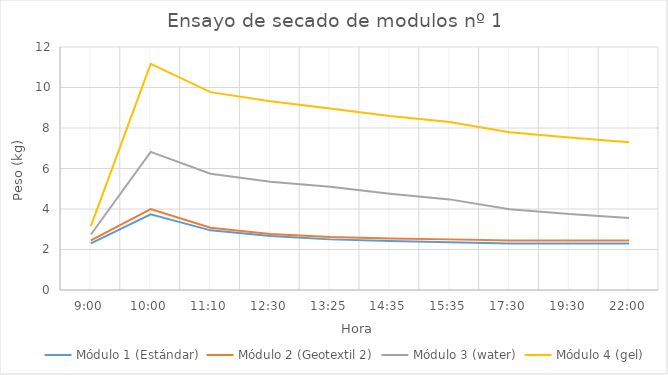
| Category | Módulo 1 (Estándar) | Módulo 2 (Geotextil 2) | Módulo 3 (water) | Módulo 4 (gel) |
|---|---|---|---|---|
| 0.375 | 2.3 | 2.445 | 2.74 | 3.155 |
| 0.4166666666666667 | 3.735 | 4 | 6.82 | 11.17 |
| 0.46527777777777773 | 2.945 | 3.075 | 5.74 | 9.77 |
| 0.5208333333333334 | 2.665 | 2.765 | 5.35 | 9.325 |
| 0.5590277777777778 | 2.5 | 2.615 | 5.095 | 8.965 |
| 0.607638888888889 | 2.425 | 2.545 | 4.755 | 8.59 |
| 0.6493055555555556 | 2.36 | 2.5 | 4.475 | 8.295 |
| 0.7291666666666666 | 2.3 | 2.445 | 3.985 | 7.785 |
| 0.8125 | 2.3 | 2.445 | 3.75 | 7.525 |
| 0.9166666666666666 | 2.3 | 2.445 | 3.55 | 7.295 |